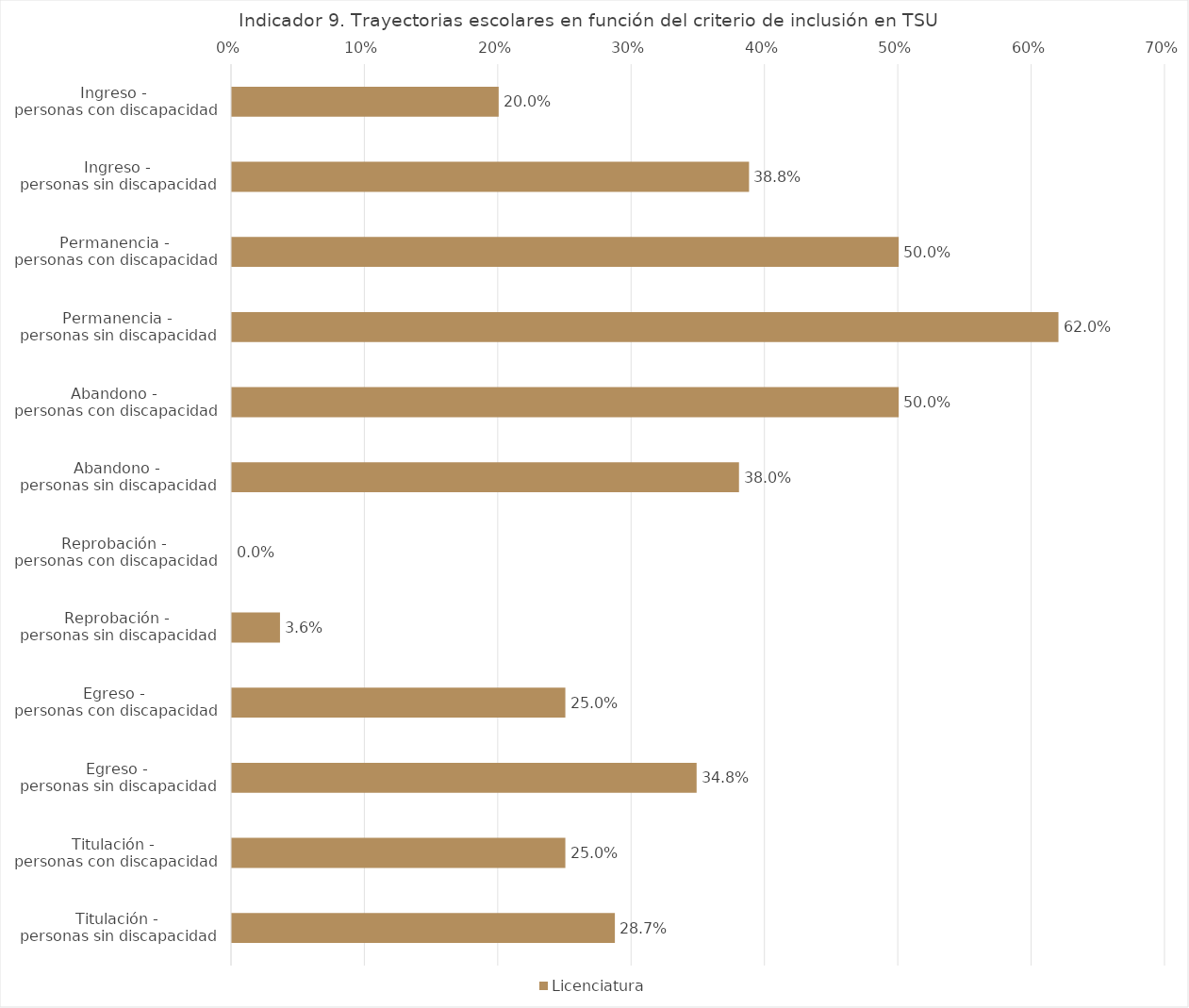
| Category | Licenciatura |
|---|---|
| Ingreso - 
personas con discapacidad | 0.2 |
| Ingreso - 
personas sin discapacidad | 0.388 |
| Permanencia - 
personas con discapacidad | 0.5 |
| Permanencia - 
personas sin discapacidad | 0.62 |
| Abandono - 
personas con discapacidad | 0.5 |
| Abandono - 
personas sin discapacidad | 0.38 |
| Reprobación - 
personas con discapacidad | 0 |
| Reprobación - 
personas sin discapacidad | 0.036 |
| Egreso - 
personas con discapacidad | 0.25 |
| Egreso - 
personas sin discapacidad | 0.348 |
| Titulación - 
personas con discapacidad | 0.25 |
| Titulación - 
personas sin discapacidad | 0.287 |